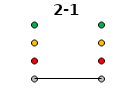
| Category | 0 | 1 | 2 | 3 | 2-1 |
|---|---|---|---|---|---|
| Time 1 | 0 | 1 | 2 | 3 | 0 |
| Time 2 | 0 | 1 | 2 | 3 | 0 |